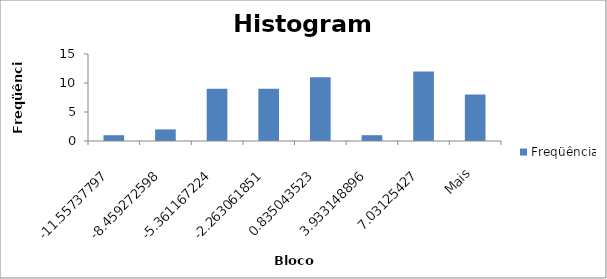
| Category | Freqüência |
|---|---|
| -11,55737797 | 1 |
| -8,459272598 | 2 |
| -5,361167224 | 9 |
| -2,263061851 | 9 |
| 0,835043523 | 11 |
| 3,933148896 | 1 |
| 7,03125427 | 12 |
| Mais | 8 |